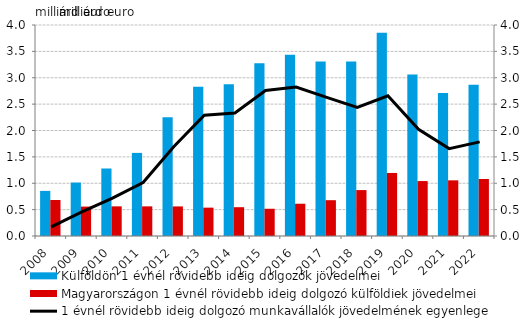
| Category | Külföldön 1 évnél rövidebb ideig dolgozók jövedelmei | Magyarországon 1 évnél rövidebb ideig dolgozó külföldiek jövedelmei |
|---|---|---|
| 2008.0 | 0.855 | 0.682 |
| 2009.0 | 1.013 | 0.558 |
| 2010.0 | 1.28 | 0.562 |
| 2011.0 | 1.576 | 0.562 |
| 2012.0 | 2.254 | 0.561 |
| 2013.0 | 2.828 | 0.538 |
| 2014.0 | 2.878 | 0.546 |
| 2015.0 | 3.275 | 0.517 |
| 2016.0 | 3.435 | 0.612 |
| 2017.0 | 3.306 | 0.679 |
| 2018.0 | 3.308 | 0.87 |
| 2019.0 | 3.853 | 1.195 |
| 2020.0 | 3.063 | 1.041 |
| 2021.0 | 2.712 | 1.055 |
| 2022.0 | 2.865 | 1.08 |